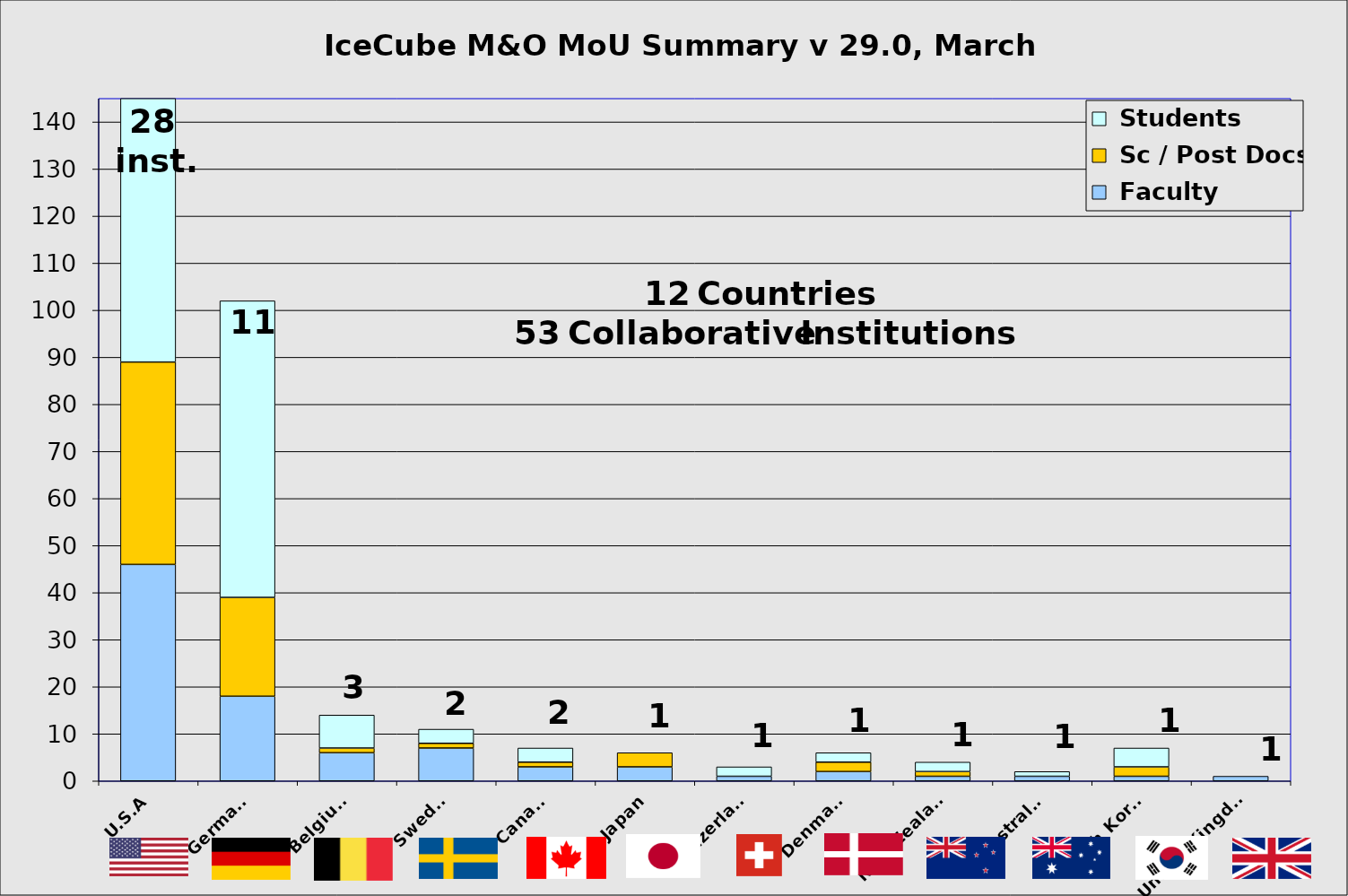
| Category |  Faculty |  Sc / Post Docs |  Students |
|---|---|---|---|
| U.S.A | 46 | 43 | 58 |
| Germany | 18 | 21 | 63 |
| Belgium | 6 | 1 | 7 |
| Sweden | 7 | 1 | 3 |
| Canada | 3 | 1 | 3 |
| Japan | 3 | 3 | 0 |
| Switzerland | 1 | 0 | 2 |
| Denmark | 2 | 2 | 2 |
| New Zealand | 1 | 1 | 2 |
| Australia | 1 | 0 | 1 |
| South Korea | 1 | 2 | 4 |
| United Kingdom | 1 | 0 | 0 |